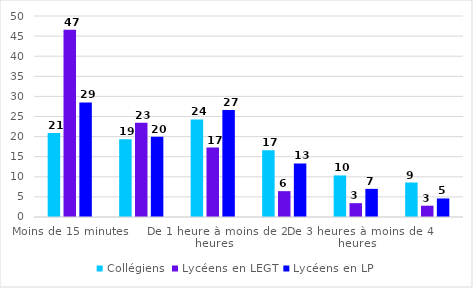
| Category | Collégiens | Lycéens en LEGT | Lycéens en LP |
|---|---|---|---|
| Moins de 15 minutes | 20.89 | 46.59 | 28.51 |
| De 15 minutes à moins de 30 minutes | 19.33 | 23.44 | 19.95 |
| De 1 heure à moins de 2 heures | 24.27 | 17.28 | 26.62 |
| De 2 heures à moins de 3 heures | 16.59 | 6.43 | 13.31 |
| De 3 heures à moins de 4 heures | 10.34 | 3.44 | 7 |
| 4 heures ou plus | 8.58 | 2.81 | 4.61 |